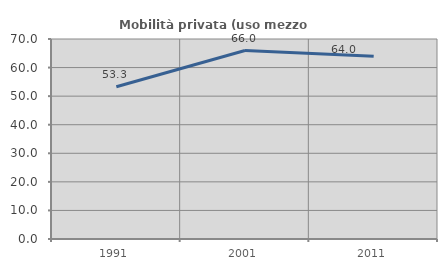
| Category | Mobilità privata (uso mezzo privato) |
|---|---|
| 1991.0 | 53.302 |
| 2001.0 | 65.951 |
| 2011.0 | 64.004 |